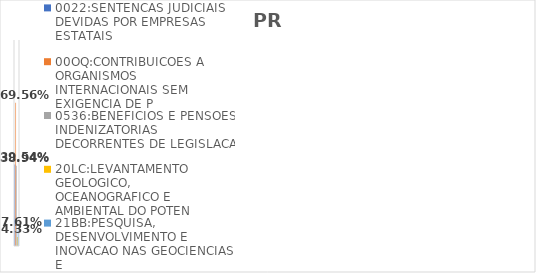
| Category | 0022:SENTENCAS JUDICIAIS DEVIDAS POR EMPRESAS ESTATAIS | 00OQ:CONTRIBUICOES A ORGANISMOS INTERNACIONAIS SEM EXIGENCIA DE P | 0536:BENEFICIOS E PENSOES INDENIZATORIAS DECORRENTES DE LEGISLACA | 20LC:LEVANTAMENTO GEOLOGICO, OCEANOGRAFICO E AMBIENTAL DO POTEN | 21BB:PESQUISA, DESENVOLVIMENTO E INOVACAO NAS GEOCIENCIAS E |
|---|---|---|---|---|---|
| EXECUTADO | 0.395 | 0.696 | 0.389 | 0.043 | 0.076 |